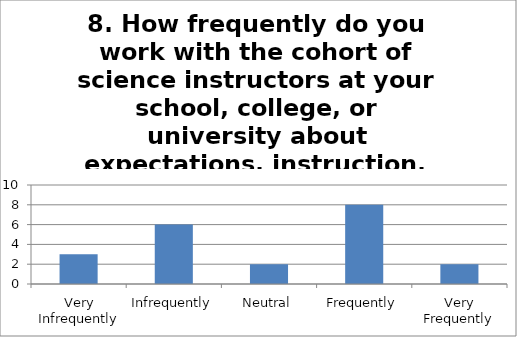
| Category | 8. How frequently do you work with the cohort of science instructors at your school, college, or university about expectations, instruction, and assessment practices for teaching writing? Responses |
|---|---|
| Very Infrequently | 3 |
| Infrequently | 6 |
| Neutral | 2 |
| Frequently | 8 |
| Very Frequently | 2 |